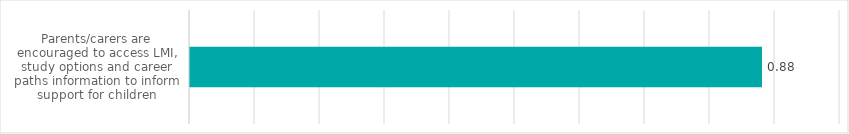
| Category | Series 0 |
|---|---|
| Parents/carers are encouraged to access LMI, study options and career paths information to inform support for children | 0.88 |